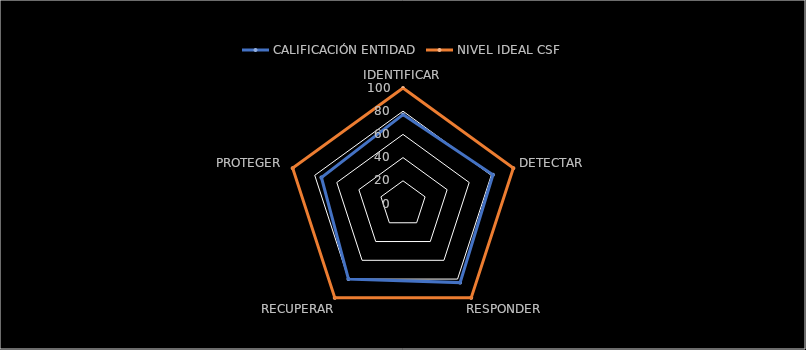
| Category | CALIFICACIÓN ENTIDAD | NIVEL IDEAL CSF |
|---|---|---|
| IDENTIFICAR | 77.083 | 100 |
| DETECTAR | 81.538 | 100 |
| RESPONDER | 83.75 | 100 |
| RECUPERAR | 80 | 100 |
| PROTEGER | 73.95 | 100 |